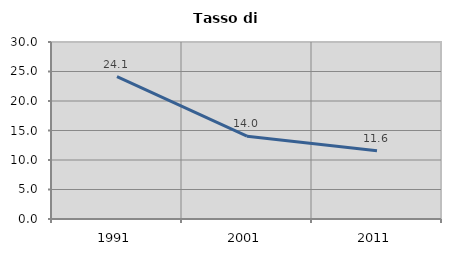
| Category | Tasso di disoccupazione   |
|---|---|
| 1991.0 | 24.146 |
| 2001.0 | 14.037 |
| 2011.0 | 11.573 |